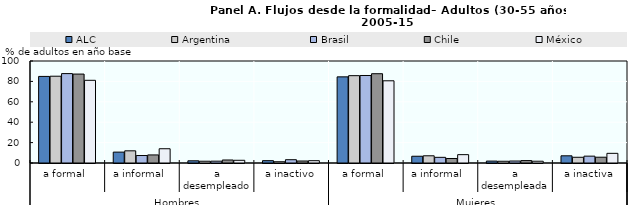
| Category | ALC | Argentina  | Brasil | Chile | México  |
|---|---|---|---|---|---|
| 0 | 84.884 | 85.092 | 87.639 | 87.19 | 81.079 |
| 1 | 10.668 | 11.936 | 7.334 | 7.916 | 13.982 |
| 2 | 2.151 | 1.742 | 1.798 | 2.946 | 2.662 |
| 3 | 2.296 | 1.23 | 3.229 | 1.948 | 2.277 |
| 4 | 84.447 | 85.617 | 85.784 | 87.543 | 80.599 |
| 5 | 6.63 | 7.068 | 5.552 | 4.414 | 8.189 |
| 6 | 1.871 | 1.705 | 1.941 | 2.373 | 1.745 |
| 7 | 7.051 | 5.61 | 6.722 | 5.669 | 9.468 |